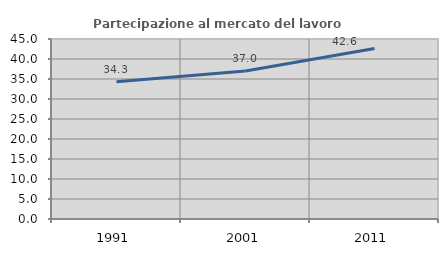
| Category | Partecipazione al mercato del lavoro  femminile |
|---|---|
| 1991.0 | 34.288 |
| 2001.0 | 36.975 |
| 2011.0 | 42.607 |